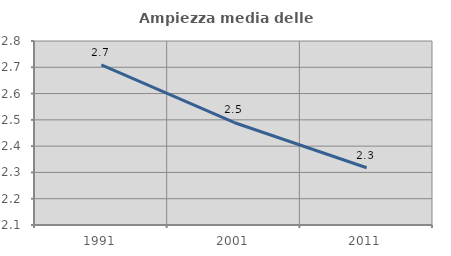
| Category | Ampiezza media delle famiglie |
|---|---|
| 1991.0 | 2.709 |
| 2001.0 | 2.49 |
| 2011.0 | 2.318 |